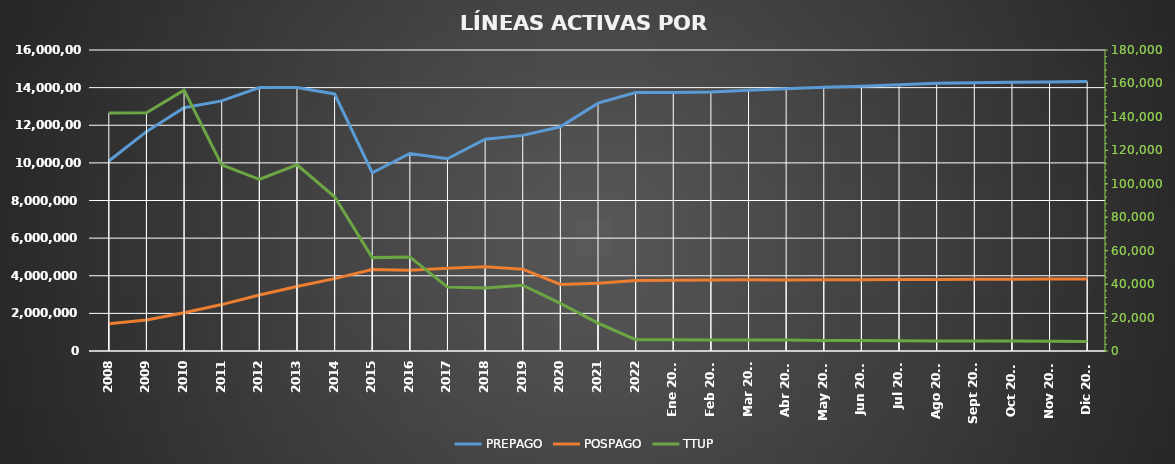
| Category | PREPAGO | POSPAGO |
|---|---|---|
| 2008 | 10097768 | 1452088 |
| 2009 | 11662294 | 1649838 |
| 2010 | 12929040 | 2033814 |
| 2011 | 13295834 | 2467378 |
| 2012 | 14008104 | 2976194 |
| 2013 | 14005126 | 3425277 |
| 2014 | 13666071 | 3846271 |
| 2015 | 9476240 | 4326937 |
| 2016 | 10498467 | 4293426 |
| 2017 | 10219457 | 4393703 |
| 2018 | 11254168 | 4480975 |
| 2019 | 11462048 | 4351686 |
| 2020 | 11917697 | 3539192 |
| 2021 | 13174530 | 3598383 |
| 2022 | 13740159 | 3743849 |
| Ene 2023 | 13744592 | 3762200 |
| Feb 2023 | 13771967 | 3773530 |
| Mar 2023 | 13859395 | 3786936 |
| Abr 2023 | 13944065 | 3768457 |
| May 2023 | 14014722 | 3780848 |
| Jun 2023 | 14075353 | 3791176 |
| Jul 2023 | 14147912 | 3799557 |
| Ago 2023 | 14231611 | 3807034 |
| Sept 2023 | 14265707 | 3810646 |
| Oct 2023 | 14279689 | 3814135 |
| Nov 2023 | 14297382 | 3822228 |
| Dic 2023 | 14330010 | 3829924 |